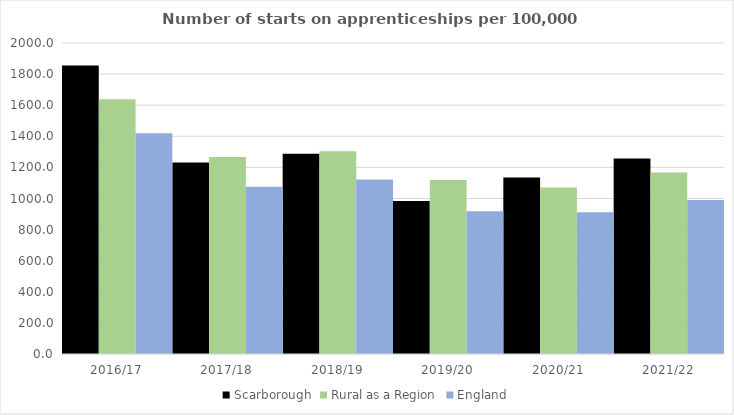
| Category | Scarborough | Rural as a Region | England |
|---|---|---|---|
| 2016/17 | 1856 | 1638.789 | 1420 |
| 2017/18 | 1232 | 1267.474 | 1075 |
| 2018/19 | 1287 | 1304.57 | 1122 |
| 2019/20 | 984 | 1119.662 | 918 |
| 2020/21 | 1135 | 1070.748 | 912 |
| 2021/22 | 1257 | 1167.68 | 991 |